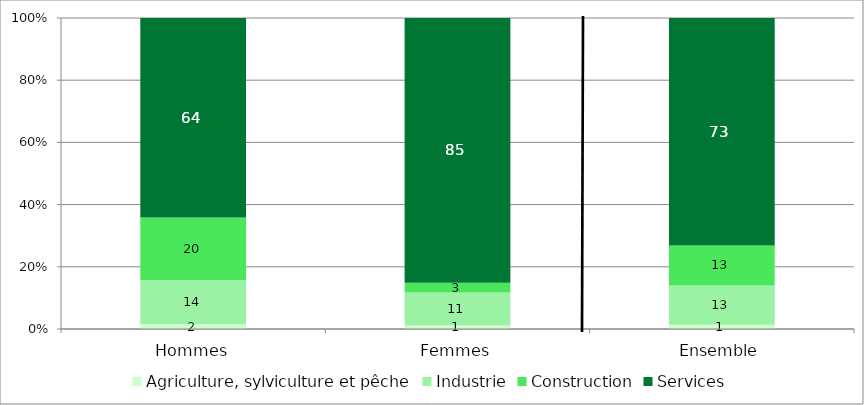
| Category | Agriculture, sylviculture et pêche | Industrie | Construction | Services |
|---|---|---|---|---|
| Hommes | 1.596 | 14.104 | 20.141 | 64.159 |
| Femmes | 1.147 | 10.615 | 3.078 | 85.16 |
| Ensemble | 1.403 | 12.61 | 12.834 | 73.153 |